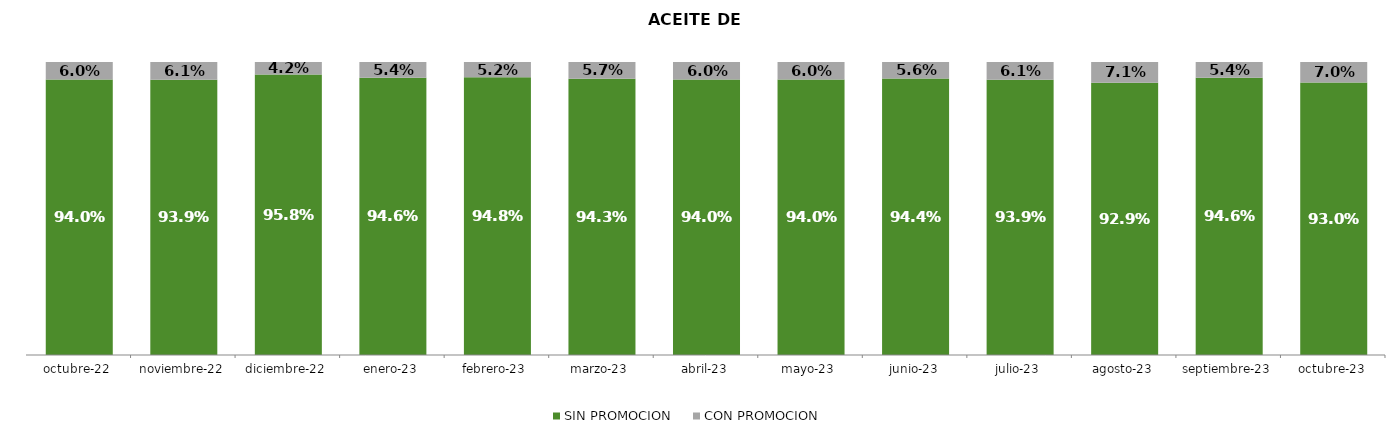
| Category | SIN PROMOCION   | CON PROMOCION   |
|---|---|---|
| 2022-10-01 | 0.94 | 0.06 |
| 2022-11-01 | 0.939 | 0.061 |
| 2022-12-01 | 0.958 | 0.042 |
| 2023-01-01 | 0.946 | 0.054 |
| 2023-02-01 | 0.948 | 0.052 |
| 2023-03-01 | 0.943 | 0.057 |
| 2023-04-01 | 0.94 | 0.06 |
| 2023-05-01 | 0.94 | 0.06 |
| 2023-06-01 | 0.944 | 0.056 |
| 2023-07-01 | 0.939 | 0.061 |
| 2023-08-01 | 0.929 | 0.071 |
| 2023-09-01 | 0.946 | 0.054 |
| 2023-10-01 | 0.93 | 0.07 |